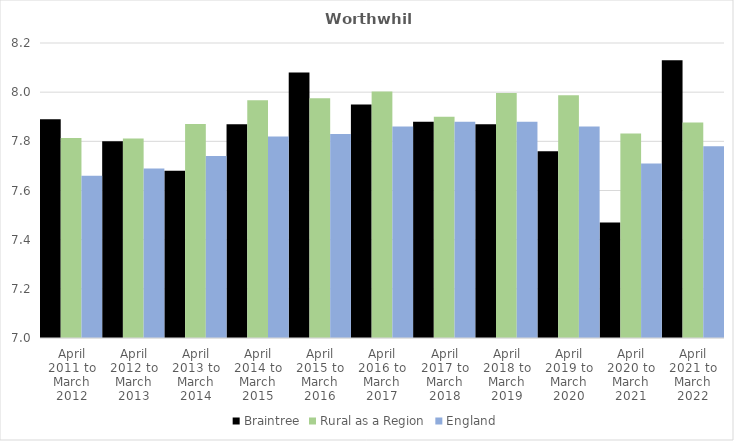
| Category | Braintree | Rural as a Region | England |
|---|---|---|---|
| April 2011 to March 2012 | 7.89 | 7.813 | 7.66 |
| April 2012 to March 2013 | 7.8 | 7.811 | 7.69 |
| April 2013 to March 2014 | 7.68 | 7.871 | 7.74 |
| April 2014 to March 2015 | 7.87 | 7.967 | 7.82 |
| April 2015 to March 2016 | 8.08 | 7.975 | 7.83 |
| April 2016 to March 2017 | 7.95 | 8.002 | 7.86 |
| April 2017 to March 2018 | 7.88 | 7.9 | 7.88 |
| April 2018 to March 2019 | 7.87 | 7.996 | 7.88 |
| April 2019 to March 2020 | 7.76 | 7.988 | 7.86 |
| April 2020 to March 2021 | 7.47 | 7.831 | 7.71 |
| April 2021 to March 2022 | 8.13 | 7.877 | 7.78 |